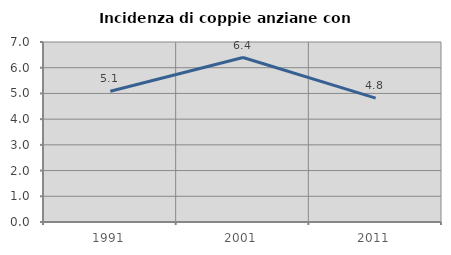
| Category | Incidenza di coppie anziane con figli |
|---|---|
| 1991.0 | 5.085 |
| 2001.0 | 6.395 |
| 2011.0 | 4.819 |